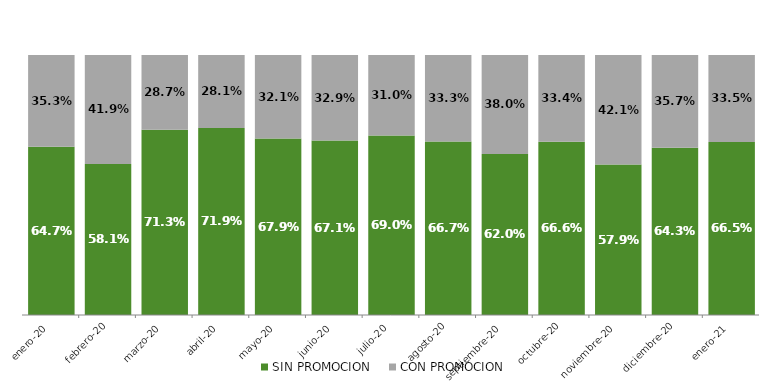
| Category | SIN PROMOCION   | CON PROMOCION   |
|---|---|---|
| 2020-01-01 | 0.647 | 0.353 |
| 2020-02-01 | 0.581 | 0.419 |
| 2020-03-01 | 0.713 | 0.287 |
| 2020-04-01 | 0.719 | 0.281 |
| 2020-05-01 | 0.679 | 0.321 |
| 2020-06-01 | 0.671 | 0.329 |
| 2020-07-01 | 0.69 | 0.31 |
| 2020-08-01 | 0.667 | 0.333 |
| 2020-09-01 | 0.62 | 0.38 |
| 2020-10-01 | 0.666 | 0.334 |
| 2020-11-01 | 0.579 | 0.421 |
| 2020-12-01 | 0.643 | 0.357 |
| 2021-01-01 | 0.665 | 0.335 |